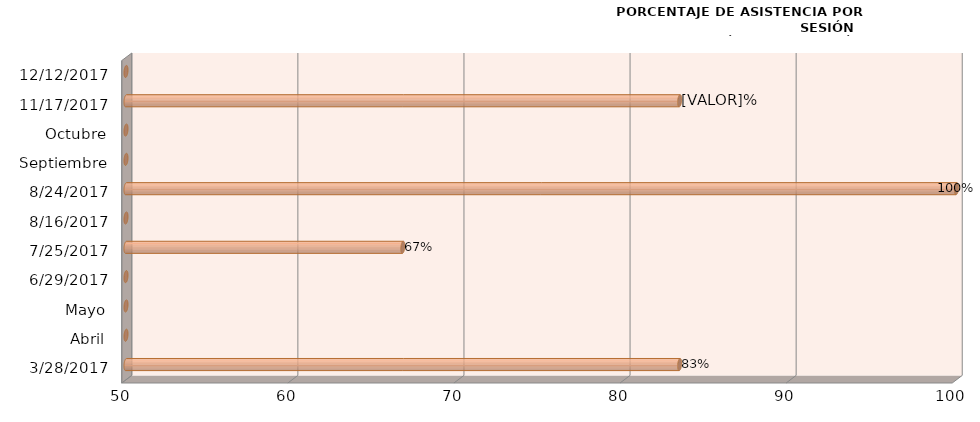
| Category | 0 |
|---|---|
| 28/03/2017 | 83.333 |
| Abril | 0 |
| Mayo | 0 |
| 29/06/2017 | 0 |
| 25/07/2017 | 66.667 |
| 16/08/2017 | 0 |
| 24/08/2017 | 100 |
| Septiembre | 0 |
| Octubre | 0 |
| 17/11/2017 | 83.333 |
| 12/12/2017 | 0 |